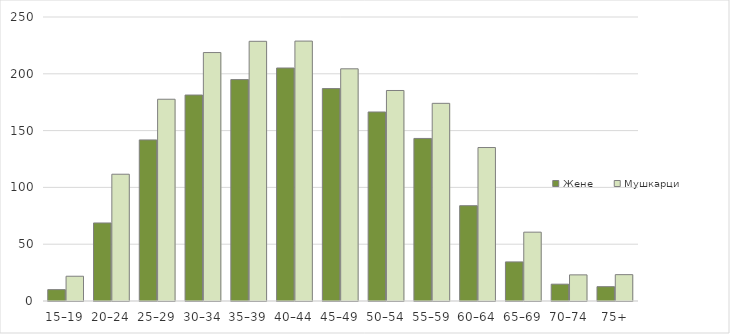
| Category | Жене | Мушкарци |
|---|---|---|
| 15–19 | 10 | 21.8 |
| 20–24 | 68.7 | 111.6 |
| 25–29 | 141.8 | 177.6 |
| 30–34 | 181.3 | 218.7 |
| 35–39 | 194.9 | 228.6 |
| 40–44 | 205.1 | 228.8 |
| 45–49 | 187 | 204.4 |
| 50–54 | 166.4 | 185.3 |
| 55–59 | 143.1 | 174 |
| 60–64 | 83.9 | 135.1 |
| 65–69 | 34.4 | 60.6 |
| 70–74 | 14.8 | 23 |
| 75+ | 12.6 | 23.2 |